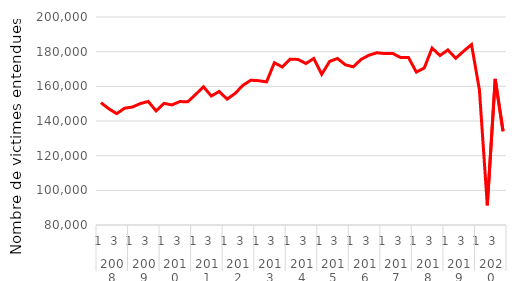
| Category | Série CVS-CJO |
|---|---|
| 0 | 150564.107 |
| 1 | 147060.121 |
| 2 | 144236.884 |
| 3 | 147377.988 |
| 4 | 148071.716 |
| 5 | 150060.084 |
| 6 | 151278.916 |
| 7 | 145816.175 |
| 8 | 150169.059 |
| 9 | 149278.269 |
| 10 | 151215.975 |
| 11 | 151049.703 |
| 12 | 155255.28 |
| 13 | 159770.365 |
| 14 | 154411.563 |
| 15 | 157038.818 |
| 16 | 152601.462 |
| 17 | 155862.158 |
| 18 | 160547.619 |
| 19 | 163509.824 |
| 20 | 163265.971 |
| 21 | 162544.778 |
| 22 | 173632.556 |
| 23 | 171123.316 |
| 24 | 175688.166 |
| 25 | 175516.787 |
| 26 | 173164.634 |
| 27 | 176105.295 |
| 28 | 166924.223 |
| 29 | 174372.44 |
| 30 | 176069.972 |
| 31 | 172428.41 |
| 32 | 171248.005 |
| 33 | 175548.624 |
| 34 | 177976.012 |
| 35 | 179365.736 |
| 36 | 178901.263 |
| 37 | 178997.349 |
| 38 | 176621.178 |
| 39 | 176662.068 |
| 40 | 168210.588 |
| 41 | 170516.075 |
| 42 | 182062.55 |
| 43 | 177785.974 |
| 44 | 180997.977 |
| 45 | 176205.266 |
| 46 | 180289.501 |
| 47 | 184103.205 |
| 48 | 157978.177 |
| 49 | 91359.92 |
| 50 | 164263.752 |
| 51 | 134112.186 |